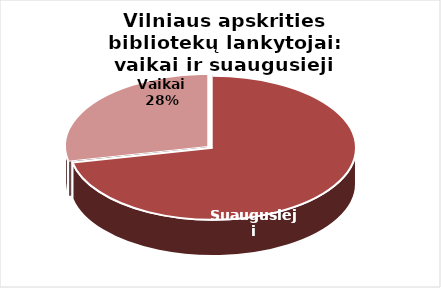
| Category | Series 0 |
|---|---|
| Suaugusieji | 849862 |
| Vaikai | 335330 |